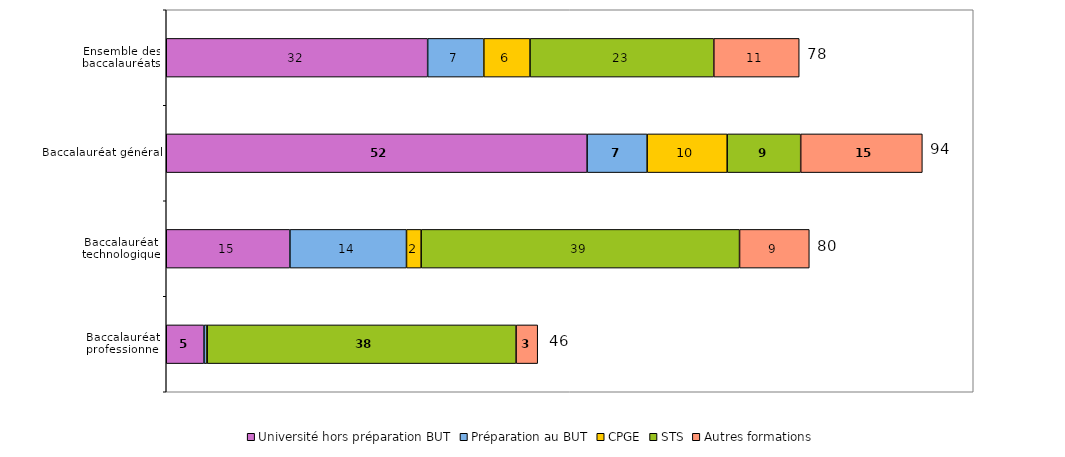
| Category | Université hors préparation BUT | Préparation au BUT | CPGE | STS | Autres formations |
|---|---|---|---|---|---|
| Ensemble des baccalauréats | 32.393 | 6.96 | 5.725 | 22.775 | 10.581 |
| Baccalauréat général | 52.149 | 7.44 | 9.918 | 9.109 | 15.075 |
| Baccalauréat technologique | 15.323 | 14.447 | 1.818 | 39.452 | 8.645 |
| Baccalauréat professionnel | 4.677 | 0.337 | 0.056 | 38.28 | 2.676 |